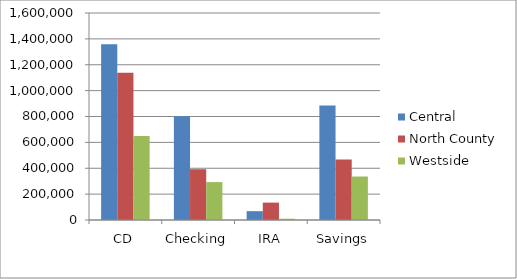
| Category | Central | North County | Westside |
|---|---|---|---|
| CD | 1359385 | 1137911 | 648549 |
| Checking | 802403 | 392516 | 292995 |
| IRA | 68380 | 134374 | 10000 |
| Savings | 885757 | 467414 | 336088 |